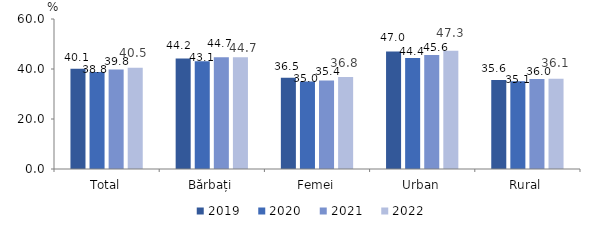
| Category | 2019 | 2020 | 2021 | 2022 |
|---|---|---|---|---|
| Total | 40.1 | 38.8 | 39.8 | 40.5 |
| Bărbați | 44.2 | 43.1 | 44.7 | 44.7 |
| Femei | 36.5 | 35 | 35.4 | 36.8 |
| Urban | 47 | 44.4 | 45.6 | 47.3 |
| Rural | 35.6 | 35.1 | 36 | 36.1 |